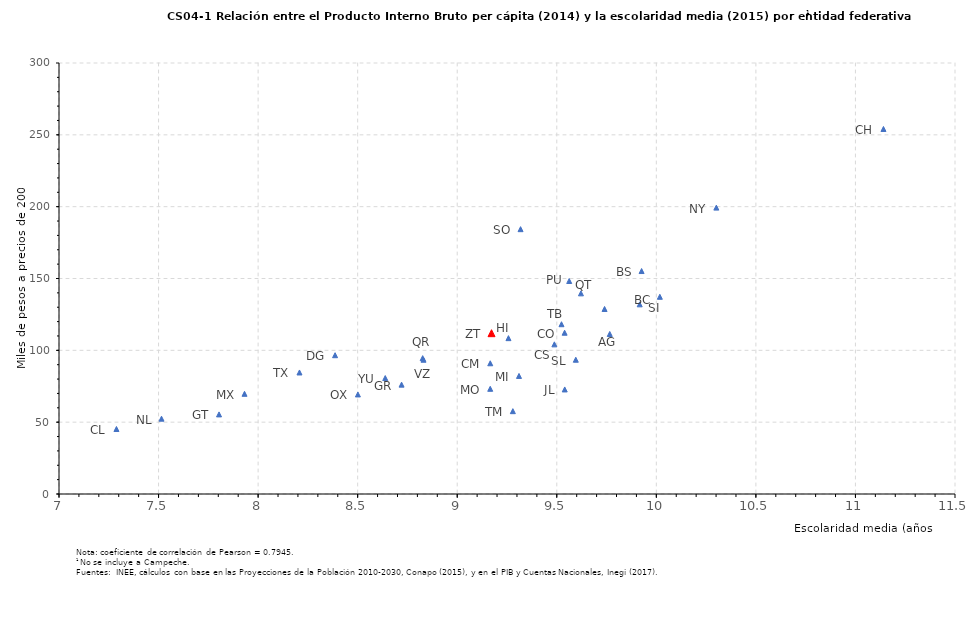
| Category | Series 0 |
|---|---|
| 9.7400007 | 128.775 |
| 9.7660729 | 111.386 |
| 9.9164639 | 132.022 |
| 9.9259009 | 155.198 |
| 9.539312 | 112.252 |
| 7.2885283 | 45.236 |
| 9.4879688 | 104.157 |
| 11.1406967 | 254.074 |
| 9.1659065 | 90.998 |
| 8.3865475 | 96.608 |
| 7.8036845 | 55.404 |
| 8.7204942 | 76.131 |
| 9.2573344 | 108.476 |
| 9.539884 | 72.774 |
| 7.9317195 | 69.746 |
| 9.3101933 | 82.184 |
| 9.1657541 | 73.223 |
| 10.3013764 | 199.34 |
| 7.5148631 | 52.423 |
| 8.5011522 | 69.291 |
| 9.5623693 | 148.256 |
| 9.6213873 | 139.665 |
| 8.8265399 | 94.557 |
| 9.5955394 | 93.46 |
| 10.0176028 | 137.265 |
| 9.318059 | 184.343 |
| 9.523646 | 118.186 |
| 9.2794254 | 57.661 |
| 8.2077685 | 84.582 |
| 8.8307834 | 93.459 |
| 8.6385048 | 80.697 |
| 9.1722454 | 111.945 |